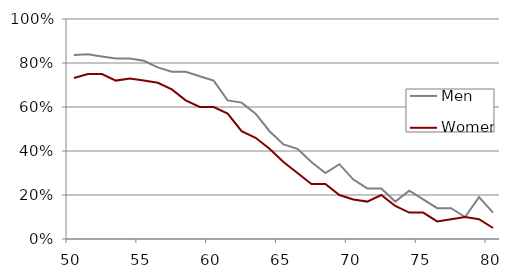
| Category | Men | Women |
|---|---|---|
| 50.0 | 0.837 | 0.732 |
| 51.0 | 0.84 | 0.75 |
| 52.0 | 0.83 | 0.75 |
| 53.0 | 0.82 | 0.72 |
| 54.0 | 0.82 | 0.73 |
| 55.0 | 0.81 | 0.72 |
| 56.0 | 0.78 | 0.71 |
| 57.0 | 0.76 | 0.68 |
| 58.0 | 0.76 | 0.63 |
| 59.0 | 0.74 | 0.6 |
| 60.0 | 0.72 | 0.6 |
| 61.0 | 0.63 | 0.57 |
| 62.0 | 0.62 | 0.49 |
| 63.0 | 0.57 | 0.46 |
| 64.0 | 0.49 | 0.41 |
| 65.0 | 0.43 | 0.35 |
| 66.0 | 0.41 | 0.3 |
| 67.0 | 0.35 | 0.25 |
| 68.0 | 0.3 | 0.25 |
| 69.0 | 0.34 | 0.2 |
| 70.0 | 0.27 | 0.18 |
| 71.0 | 0.23 | 0.17 |
| 72.0 | 0.23 | 0.2 |
| 73.0 | 0.17 | 0.15 |
| 74.0 | 0.22 | 0.12 |
| 75.0 | 0.18 | 0.12 |
| 76.0 | 0.14 | 0.08 |
| 77.0 | 0.14 | 0.09 |
| 78.0 | 0.1 | 0.1 |
| 79.0 | 0.19 | 0.09 |
| 80.0 | 0.12 | 0.05 |